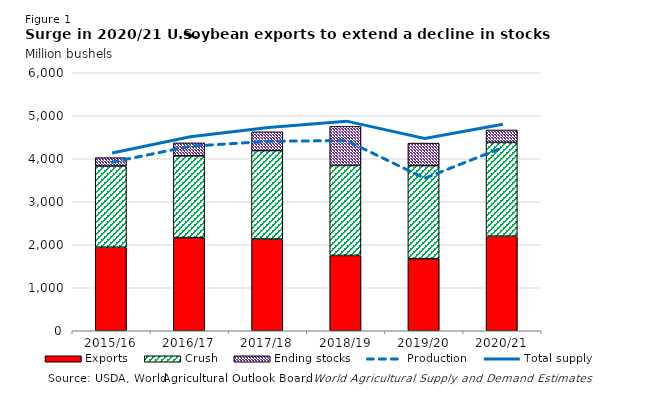
| Category | Exports | Crush | Ending stocks |
|---|---|---|---|
| 2015/16 | 1942.606 | 1886.237 | 196.729 |
| 2016/17 | 2166.55 | 1901.198 | 301.595 |
| 2017/18 | 2133.73 | 2054.932 | 438.105 |
| 2018/19 | 1751.809 | 2091.99 | 909.052 |
| 2019/20 | 1676.257 | 2164.554 | 523.478 |
| 2020/21 | 2200 | 2180 | 290 |